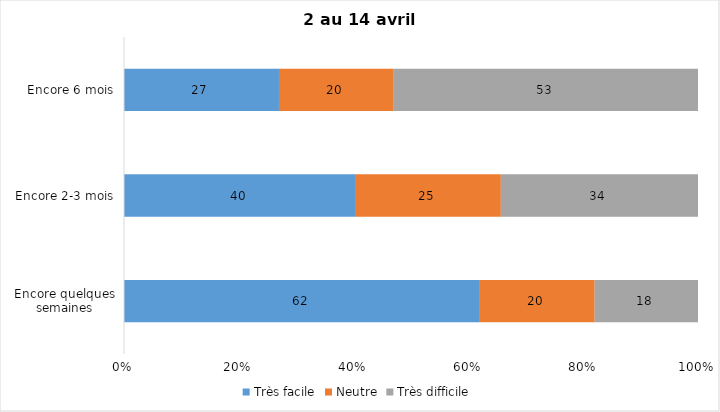
| Category | Très facile | Neutre | Très difficile |
|---|---|---|---|
| Encore quelques semaines | 62 | 20 | 18 |
| Encore 2-3 mois | 40 | 25 | 34 |
| Encore 6 mois | 27 | 20 | 53 |